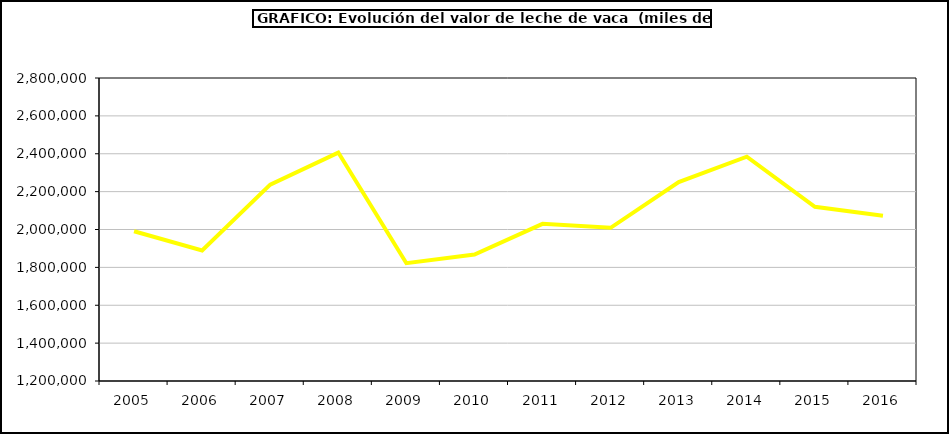
| Category | Leche de vaca |
|---|---|
| 2005.0 | 1990688.134 |
| 2006.0 | 1889082.207 |
| 2007.0 | 2236712.763 |
| 2008.0 | 2406229.051 |
| 2009.0 | 1822023.094 |
| 2010.0 | 1867616.94 |
| 2011.0 | 2029996.881 |
| 2012.0 | 2008801.055 |
| 2013.0 | 2250497.404 |
| 2014.0 | 2384761.493 |
| 2015.0 | 2119762.267 |
| 2016.0 | 2072491.339 |